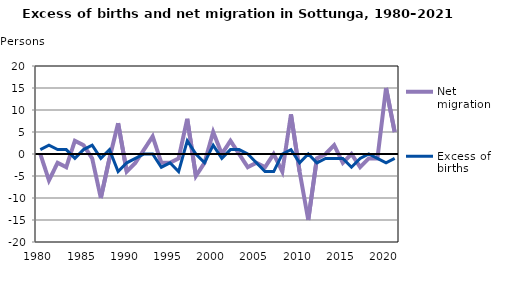
| Category | Net migration | Excess of births |
|---|---|---|
| 1980.0 | 0 | 1 |
| 1981.0 | -6 | 2 |
| 1982.0 | -2 | 1 |
| 1983.0 | -3 | 1 |
| 1984.0 | 3 | -1 |
| 1985.0 | 2 | 1 |
| 1986.0 | -1 | 2 |
| 1987.0 | -10 | -1 |
| 1988.0 | -1 | 1 |
| 1989.0 | 7 | -4 |
| 1990.0 | -4 | -2 |
| 1991.0 | -2 | -1 |
| 1992.0 | 1 | 0 |
| 1993.0 | 4 | 0 |
| 1994.0 | -2 | -3 |
| 1995.0 | -2 | -2 |
| 1996.0 | -1 | -4 |
| 1997.0 | 8 | 3 |
| 1998.0 | -5 | 0 |
| 1999.0 | -2 | -2 |
| 2000.0 | 5 | 2 |
| 2001.0 | 0 | -1 |
| 2002.0 | 3 | 1 |
| 2003.0 | 0 | 1 |
| 2004.0 | -3 | 0 |
| 2005.0 | -2 | -2 |
| 2006.0 | -3 | -4 |
| 2007.0 | 0 | -4 |
| 2008.0 | -4 | 0 |
| 2009.0 | 9 | 1 |
| 2010.0 | -4 | -2 |
| 2011.0 | -15 | 0 |
| 2012.0 | -1 | -2 |
| 2013.0 | 0 | -1 |
| 2014.0 | 2 | -1 |
| 2015.0 | -2 | -1 |
| 2016.0 | 0 | -3 |
| 2017.0 | -3 | -1 |
| 2018.0 | -1 | 0 |
| 2019.0 | -1 | -1 |
| 2020.0 | 15 | -2 |
| 2021.0 | 5 | -1 |